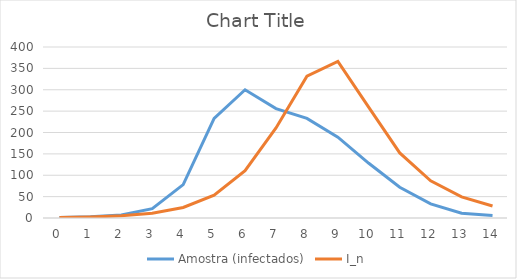
| Category | Amostra (infectados) | I_n |
|---|---|---|
| 0.0 | 1 | 1 |
| 1.0 | 3 | 2.238 |
| 2.0 | 7 | 4.999 |
| 3.0 | 22 | 11.128 |
| 4.0 | 78 | 24.565 |
| 5.0 | 233 | 53.237 |
| 6.0 | 300 | 110.745 |
| 7.0 | 256 | 210.639 |
| 8.0 | 233 | 331.71 |
| 9.0 | 189 | 366.252 |
| 10.0 | 128 | 258.835 |
| 11.0 | 72 | 152.299 |
| 12.0 | 33 | 87.148 |
| 13.0 | 11 | 49.51 |
| 14.0 | 6 | 28.05 |